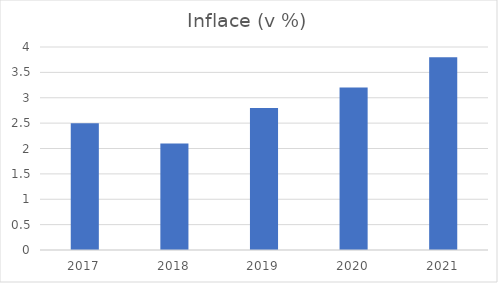
| Category | Inflace (v %) |
|---|---|
| 2017.0 | 2.5 |
| 2018.0 | 2.1 |
| 2019.0 | 2.8 |
| 2020.0 | 3.2 |
| 2021.0 | 3.8 |